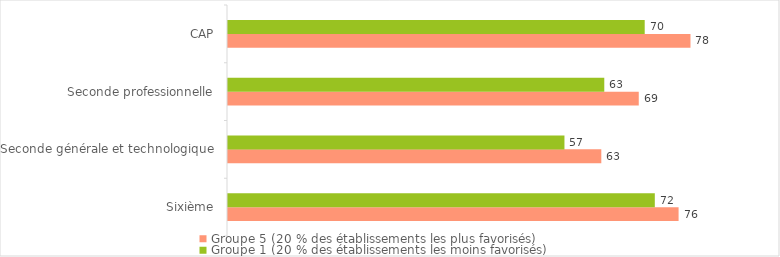
| Category | Groupe 5 (20 % des établissements les plus favorisés) | Groupe 1 (20 % des établissements les moins favorisés) |
|---|---|---|
| Sixième | 75.8 | 71.8 |
| Seconde générale et technologique | 62.8 | 56.6 |
| Seconde professionnelle | 69.1 | 63.3 |
| CAP | 77.8 | 70.1 |